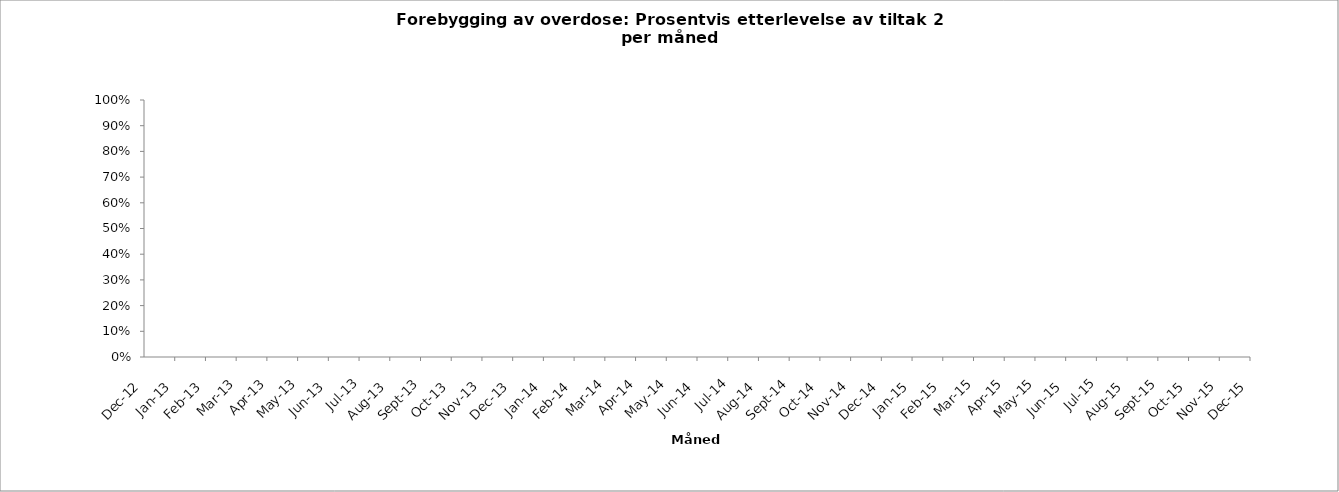
| Category | p_P2 | m_P2 |
|---|---|---|
| 2012-12-01 |  | 0 |
| 2013-01-01 |  | 0 |
| 2013-02-01 |  | 0 |
| 2013-03-01 |  | 0 |
| 2013-04-01 |  | 0 |
| 2013-05-01 |  | 0 |
| 2013-06-01 |  | 0 |
| 2013-07-01 |  | 0 |
| 2013-08-01 |  | 0 |
| 2013-09-01 |  | 0 |
| 2013-10-01 |  | 0 |
| 2013-11-01 |  | 0 |
| 2013-12-01 |  | 0 |
| 2014-01-01 |  | 0 |
| 2014-02-01 |  | 0 |
| 2014-03-01 |  | 0 |
| 2014-04-01 |  | 0 |
| 2014-05-01 |  | 0 |
| 2014-06-01 |  | 0 |
| 2014-07-01 |  | 0 |
| 2014-08-01 |  | 0 |
| 2014-09-01 |  | 0 |
| 2014-10-01 |  | 0 |
| 2014-11-01 |  | 0 |
| 2014-12-01 |  | 0 |
| 2015-01-01 |  | 0 |
| 2015-02-01 |  | 0 |
| 2015-03-01 |  | 0 |
| 2015-04-01 |  | 0 |
| 2015-05-01 |  | 0 |
| 2015-06-01 |  | 0 |
| 2015-07-01 |  | 0 |
| 2015-08-01 |  | 0 |
| 2015-09-01 |  | 0 |
| 2015-10-01 |  | 0 |
| 2015-11-01 |  | 0 |
| 2015-12-01 |  | 0 |